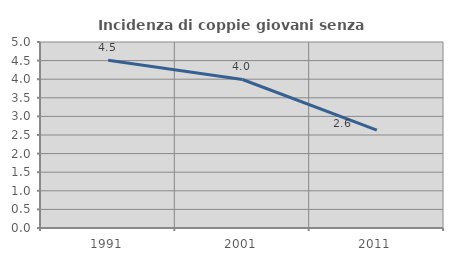
| Category | Incidenza di coppie giovani senza figli |
|---|---|
| 1991.0 | 4.51 |
| 2001.0 | 3.992 |
| 2011.0 | 2.629 |